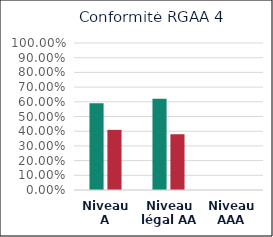
| Category | C | NC |
|---|---|---|
| Niveau A | 0.591 | 0.409 |
| Niveau légal AA | 0.621 | 0.379 |
| Niveau AAA | 0 | 0 |